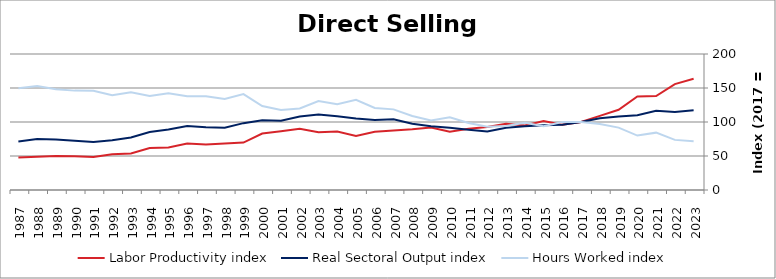
| Category | Labor Productivity index | Real Sectoral Output index | Hours Worked index |
|---|---|---|---|
| 2023.0 | 163.562 | 117.277 | 71.702 |
| 2022.0 | 155.73 | 114.769 | 73.697 |
| 2021.0 | 138.206 | 116.553 | 84.333 |
| 2020.0 | 137.435 | 109.998 | 80.036 |
| 2019.0 | 118.026 | 108.233 | 91.702 |
| 2018.0 | 108.967 | 105.66 | 96.965 |
| 2017.0 | 100 | 100 | 100 |
| 2016.0 | 95.94 | 95.86 | 99.916 |
| 2015.0 | 101.351 | 95.05 | 93.783 |
| 2014.0 | 94.82 | 93.713 | 98.833 |
| 2013.0 | 97.404 | 91.614 | 94.056 |
| 2012.0 | 92.586 | 86.08 | 92.973 |
| 2011.0 | 90.071 | 88.729 | 98.51 |
| 2010.0 | 85.568 | 91.581 | 107.027 |
| 2009.0 | 91.809 | 93.748 | 102.112 |
| 2008.0 | 89.415 | 97.298 | 108.817 |
| 2007.0 | 87.668 | 103.947 | 118.569 |
| 2006.0 | 85.503 | 103.069 | 120.544 |
| 2005.0 | 79.406 | 105.291 | 132.597 |
| 2004.0 | 86.005 | 108.442 | 126.088 |
| 2003.0 | 84.783 | 110.863 | 130.76 |
| 2002.0 | 90.209 | 108.231 | 119.979 |
| 2001.0 | 86.436 | 101.744 | 117.71 |
| 2000.0 | 83.069 | 102.642 | 123.563 |
| 1999.0 | 69.696 | 98.304 | 141.046 |
| 1998.0 | 68.303 | 91.42 | 133.844 |
| 1997.0 | 66.902 | 92.334 | 138.015 |
| 1996.0 | 68.319 | 94.242 | 137.944 |
| 1995.0 | 62.445 | 88.909 | 142.379 |
| 1994.0 | 61.783 | 85.373 | 138.183 |
| 1993.0 | 53.761 | 77.238 | 143.668 |
| 1992.0 | 52.592 | 73.27 | 139.317 |
| 1991.0 | 48.401 | 70.575 | 145.813 |
| 1990.0 | 49.595 | 72.478 | 146.14 |
| 1989.0 | 50.159 | 74.289 | 148.107 |
| 1988.0 | 49.002 | 74.945 | 152.943 |
| 1987.0 | 47.668 | 71.251 | 149.473 |